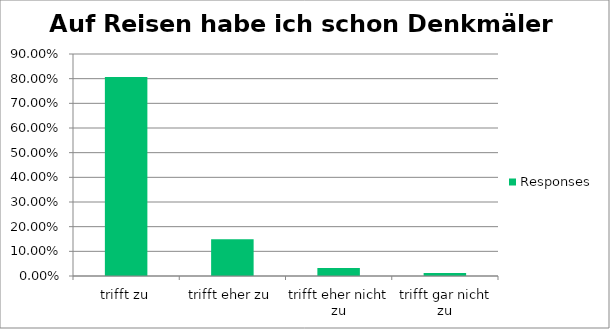
| Category | Responses |
|---|---|
| trifft zu | 0.807 |
| trifft eher zu | 0.149 |
| trifft eher nicht zu | 0.032 |
| trifft gar nicht zu | 0.012 |